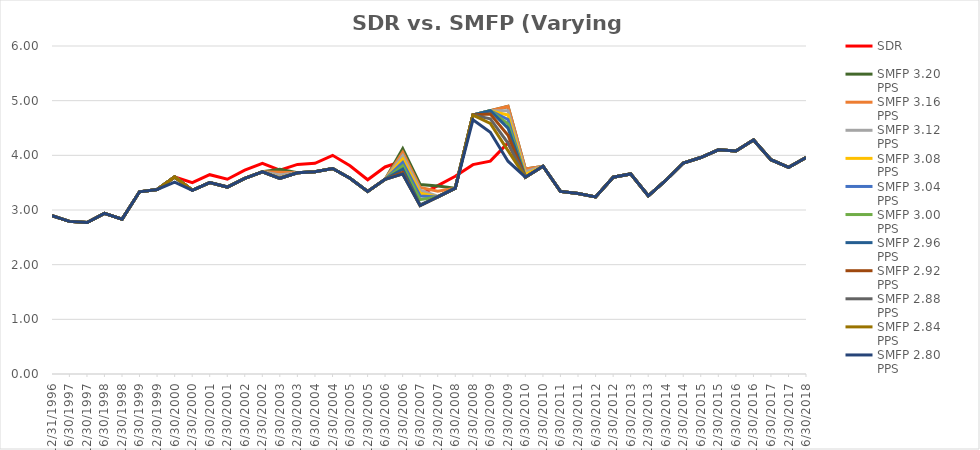
| Category | SDR | SMFP 3.20 PPS | SMFP 3.16 PPS | SMFP 3.12 PPS | SMFP 3.08 PPS | SMFP 3.04 PPS | SMFP 3.00 PPS | SMFP 2.96 PPS | SMFP 2.92 PPS | SMFP 2.88 PPS | SMFP 2.84 PPS | SMFP 2.80 PPS |
|---|---|---|---|---|---|---|---|---|---|---|---|---|
| 12/31/96 | 2.896 | 2.896 | 2.896 | 2.896 | 2.896 | 2.896 | 2.896 | 2.896 | 2.896 | 2.896 | 2.896 | 2.896 |
| 6/30/97 | 2.792 | 2.792 | 2.792 | 2.792 | 2.792 | 2.792 | 2.792 | 2.792 | 2.792 | 2.792 | 2.792 | 2.792 |
| 12/31/97 | 2.771 | 2.771 | 2.771 | 2.771 | 2.771 | 2.771 | 2.771 | 2.771 | 2.771 | 2.771 | 2.771 | 2.771 |
| 6/30/98 | 2.938 | 2.938 | 2.938 | 2.938 | 2.938 | 2.938 | 2.938 | 2.938 | 2.938 | 2.938 | 2.938 | 2.938 |
| 12/31/98 | 2.833 | 2.833 | 2.833 | 2.833 | 2.833 | 2.833 | 2.833 | 2.833 | 2.833 | 2.833 | 2.833 | 2.833 |
| 6/30/99 | 3.333 | 3.333 | 3.333 | 3.333 | 3.333 | 3.333 | 3.333 | 3.333 | 3.333 | 3.333 | 3.333 | 3.333 |
| 12/31/99 | 3.375 | 3.375 | 3.375 | 3.375 | 3.375 | 3.375 | 3.375 | 3.375 | 3.375 | 3.375 | 3.375 | 3.375 |
| 6/30/00 | 3.604 | 3.604 | 3.604 | 3.604 | 3.604 | 3.604 | 3.604 | 3.604 | 3.604 | 3.604 | 3.604 | 3.509 |
| 12/31/00 | 3.5 | 3.36 | 3.36 | 3.36 | 3.36 | 3.36 | 3.36 | 3.36 | 3.36 | 3.36 | 3.36 | 3.36 |
| 6/30/01 | 3.646 | 3.5 | 3.5 | 3.5 | 3.5 | 3.5 | 3.5 | 3.5 | 3.5 | 3.5 | 3.5 | 3.5 |
| 12/31/01 | 3.562 | 3.42 | 3.42 | 3.42 | 3.42 | 3.42 | 3.42 | 3.42 | 3.42 | 3.42 | 3.42 | 3.42 |
| 6/30/02 | 3.729 | 3.58 | 3.58 | 3.58 | 3.58 | 3.58 | 3.58 | 3.58 | 3.58 | 3.58 | 3.58 | 3.58 |
| 12/31/02 | 3.854 | 3.7 | 3.7 | 3.7 | 3.7 | 3.7 | 3.7 | 3.7 | 3.7 | 3.7 | 3.7 | 3.7 |
| 6/30/03 | 3.729 | 3.743 | 3.692 | 3.64 | 3.589 | 3.58 | 3.58 | 3.58 | 3.58 | 3.58 | 3.58 | 3.58 |
| 12/31/03 | 3.833 | 3.68 | 3.68 | 3.68 | 3.68 | 3.68 | 3.68 | 3.68 | 3.68 | 3.68 | 3.68 | 3.68 |
| 6/30/04 | 3.854 | 3.7 | 3.7 | 3.7 | 3.7 | 3.7 | 3.7 | 3.7 | 3.7 | 3.7 | 3.7 | 3.7 |
| 12/31/04 | 4 | 3.76 | 3.76 | 3.76 | 3.76 | 3.76 | 3.76 | 3.76 | 3.76 | 3.76 | 3.76 | 3.76 |
| 6/30/05 | 3.809 | 3.58 | 3.58 | 3.58 | 3.58 | 3.58 | 3.58 | 3.58 | 3.58 | 3.58 | 3.58 | 3.58 |
| 12/31/05 | 3.553 | 3.34 | 3.34 | 3.34 | 3.34 | 3.34 | 3.34 | 3.34 | 3.34 | 3.34 | 3.34 | 3.34 |
| 6/30/06 | 3.787 | 3.56 | 3.56 | 3.56 | 3.56 | 3.56 | 3.56 | 3.56 | 3.56 | 3.56 | 3.56 | 3.56 |
| 12/31/06 | 3.894 | 4.12 | 4.057 | 3.995 | 3.932 | 3.87 | 3.809 | 3.748 | 3.687 | 3.66 | 3.66 | 3.66 |
| 6/30/07 | 3.277 | 3.467 | 3.414 | 3.362 | 3.309 | 3.257 | 3.189 | 3.095 | 3.08 | 3.08 | 3.08 | 3.08 |
| 12/31/07 | 3.447 | 3.441 | 3.344 | 3.251 | 3.24 | 3.24 | 3.24 | 3.24 | 3.24 | 3.24 | 3.24 | 3.24 |
| 6/30/08 | 3.617 | 3.4 | 3.4 | 3.4 | 3.4 | 3.4 | 3.4 | 3.4 | 3.4 | 3.4 | 3.4 | 3.4 |
| 12/31/08 | 3.83 | 4.737 | 4.737 | 4.737 | 4.737 | 4.737 | 4.737 | 4.737 | 4.737 | 4.737 | 4.736 | 4.649 |
| 6/30/09 | 3.894 | 4.816 | 4.816 | 4.816 | 4.816 | 4.816 | 4.816 | 4.816 | 4.754 | 4.669 | 4.584 | 4.423 |
| 12/31/09 | 4.227 | 4.895 | 4.895 | 4.817 | 4.736 | 4.656 | 4.577 | 4.498 | 4.369 | 4.225 | 4.086 | 3.893 |
| 6/30/10 | 3.6 | 3.75 | 3.75 | 3.702 | 3.653 | 3.604 | 3.6 | 3.6 | 3.6 | 3.6 | 3.6 | 3.6 |
| 12/31/10 | 3.8 | 3.8 | 3.8 | 3.8 | 3.8 | 3.8 | 3.8 | 3.8 | 3.8 | 3.8 | 3.8 | 3.8 |
| 6/30/11 | 3.34 | 3.34 | 3.34 | 3.34 | 3.34 | 3.34 | 3.34 | 3.34 | 3.34 | 3.34 | 3.34 | 3.34 |
| 12/31/11 | 3.3 | 3.3 | 3.3 | 3.3 | 3.3 | 3.3 | 3.3 | 3.3 | 3.3 | 3.3 | 3.3 | 3.3 |
| 6/30/12 | 3.24 | 3.24 | 3.24 | 3.24 | 3.24 | 3.24 | 3.24 | 3.24 | 3.24 | 3.24 | 3.24 | 3.24 |
| 12/31/12 | 3.6 | 3.6 | 3.6 | 3.6 | 3.6 | 3.6 | 3.6 | 3.6 | 3.6 | 3.6 | 3.6 | 3.6 |
| 6/30/13 | 3.66 | 3.66 | 3.66 | 3.66 | 3.66 | 3.66 | 3.66 | 3.66 | 3.66 | 3.66 | 3.66 | 3.66 |
| 12/31/13 | 3.26 | 3.26 | 3.26 | 3.26 | 3.26 | 3.26 | 3.26 | 3.26 | 3.26 | 3.26 | 3.26 | 3.26 |
| 6/30/14 | 3.54 | 3.54 | 3.54 | 3.54 | 3.54 | 3.54 | 3.54 | 3.54 | 3.54 | 3.54 | 3.54 | 3.54 |
| 12/31/14 | 3.86 | 3.86 | 3.86 | 3.86 | 3.86 | 3.86 | 3.86 | 3.86 | 3.86 | 3.86 | 3.86 | 3.86 |
| 6/30/15 | 3.96 | 3.96 | 3.96 | 3.96 | 3.96 | 3.96 | 3.96 | 3.96 | 3.96 | 3.96 | 3.96 | 3.96 |
| 12/31/15 | 4.1 | 4.1 | 4.1 | 4.1 | 4.1 | 4.1 | 4.1 | 4.1 | 4.1 | 4.1 | 4.1 | 4.1 |
| 6/30/16 | 4.08 | 4.08 | 4.08 | 4.08 | 4.08 | 4.08 | 4.08 | 4.08 | 4.08 | 4.08 | 4.08 | 4.08 |
| 12/31/16 | 4.28 | 4.28 | 4.28 | 4.28 | 4.28 | 4.28 | 4.28 | 4.28 | 4.28 | 4.28 | 4.28 | 4.28 |
| 6/30/17 | 3.92 | 3.92 | 3.92 | 3.92 | 3.92 | 3.92 | 3.92 | 3.92 | 3.92 | 3.92 | 3.92 | 3.92 |
| 12/31/17 | 3.78 | 3.78 | 3.78 | 3.78 | 3.78 | 3.78 | 3.78 | 3.78 | 3.78 | 3.78 | 3.78 | 3.78 |
| 6/30/18 | 3.96 | 3.96 | 3.96 | 3.96 | 3.96 | 3.96 | 3.96 | 3.96 | 3.96 | 3.96 | 3.96 | 3.96 |